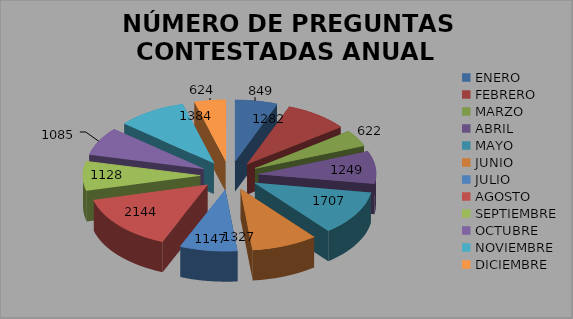
| Category |  NÚMERO DE PREGUNTAS CONTESTADAS ANUAL 2016 |
|---|---|
| ENERO | 849 |
| FEBRERO | 1282 |
| MARZO | 622 |
| ABRIL | 1249 |
| MAYO | 1707 |
| JUNIO | 1327 |
| JULIO | 1147 |
| AGOSTO | 2144 |
| SEPTIEMBRE | 1128 |
| OCTUBRE | 1085 |
| NOVIEMBRE | 1384 |
| DICIEMBRE | 624 |